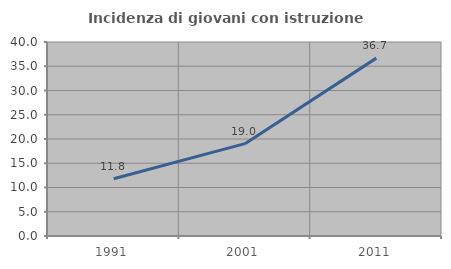
| Category | Incidenza di giovani con istruzione universitaria |
|---|---|
| 1991.0 | 11.796 |
| 2001.0 | 19.037 |
| 2011.0 | 36.676 |